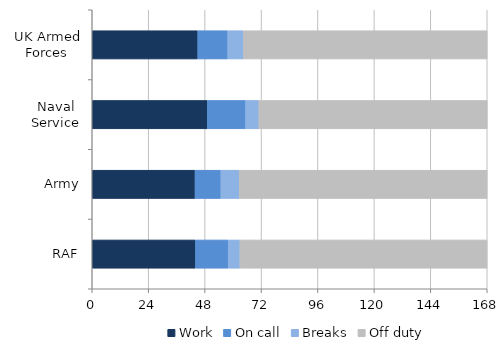
| Category | Work | On call | Breaks | Off duty |
|---|---|---|---|---|
| UK Armed Forces | 44.875 | 12.77 | 6.706 | 103.616 |
| Naval Service | 48.924 | 16.326 | 5.646 | 97.098 |
| Army | 43.744 | 11.005 | 7.77 | 105.444 |
| RAF | 43.935 | 13.903 | 5.005 | 105.109 |